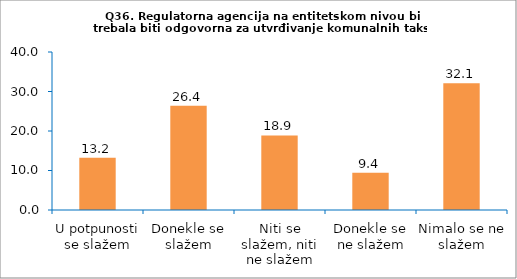
| Category | Series 0 |
|---|---|
| U potpunosti se slažem | 13.208 |
| Donekle se slažem | 26.415 |
| Niti se slažem, niti ne slažem | 18.868 |
| Donekle se ne slažem | 9.434 |
| Nimalo se ne slažem | 32.075 |